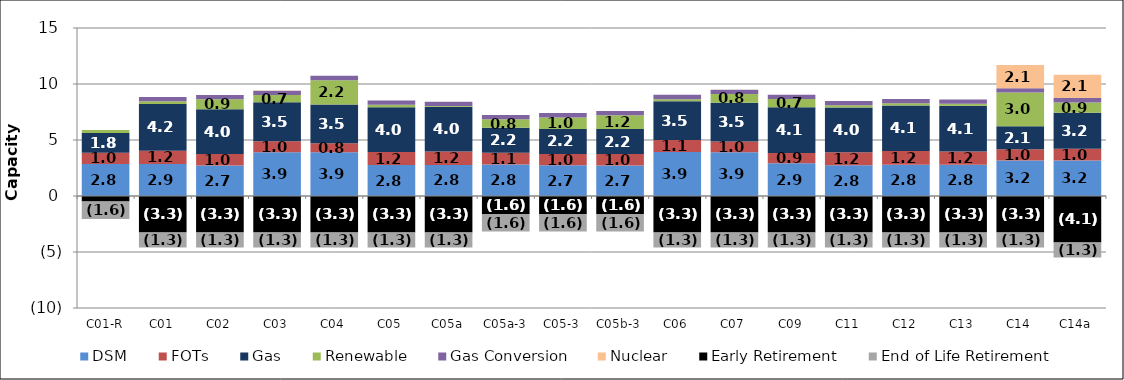
| Category | DSM | FOTs | Gas | Renewable | Gas Conversion | Nuclear | Early Retirement | End of Life Retirement |
|---|---|---|---|---|---|---|---|---|
| C01-R | 2.847 | 1.013 | 1.772 | 0.263 | 0 | 0 | -0.502 | -1.552 |
| C01 | 2.859 | 1.175 | 4.185 | 0.24 | 0.387 | 0.002 | -3.26 | -1.342 |
| C02 | 2.732 | 1.024 | 3.998 | 0.886 | 0.387 | 0 | -3.26 | -1.342 |
| C03 | 3.912 | 0.988 | 3.464 | 0.656 | 0.387 | 0.004 | -3.26 | -1.342 |
| C04 | 3.914 | 0.801 | 3.464 | 2.161 | 0.387 | 0 | -3.26 | -1.342 |
| C05 | 2.758 | 1.173 | 3.998 | 0.221 | 0.387 | 0 | -3.26 | -1.342 |
| C05a | 2.777 | 1.193 | 3.998 | 0.071 | 0.387 | 0 | -3.26 | -1.342 |
| C05a-3 | 2.81 | 1.059 | 2.217 | 0.764 | 0.387 | 0 | -1.608 | -1.554 |
| C05-3 | 2.735 | 1.026 | 2.217 | 1.039 | 0.387 | 0 | -1.608 | -1.554 |
| C05b-3 | 2.729 | 1.028 | 2.217 | 1.226 | 0.387 | 0 | -1.608 | -1.554 |
| C06 | 3.919 | 1.086 | 3.464 | 0.175 | 0.387 | 0 | -3.26 | -1.342 |
| C07 | 3.914 | 0.957 | 3.464 | 0.767 | 0.387 | 0 | -3.26 | -1.342 |
| C09 | 2.927 | 0.908 | 4.099 | 0.727 | 0.387 | 0 | -3.26 | -1.342 |
| C11 | 2.755 | 1.157 | 3.998 | 0.187 | 0.387 | 0 | -3.26 | -1.342 |
| C12 | 2.799 | 1.208 | 4.083 | 0.182 | 0.387 | 0 | -3.26 | -1.342 |
| C13 | 2.801 | 1.17 | 4.083 | 0.182 | 0.387 | 0 | -3.26 | -1.342 |
| C14 | 3.164 | 1.002 | 2.066 | 2.999 | 0.387 | 2.074 | -3.26 | -1.342 |
| C14a | 3.173 | 1.046 | 3.207 | 0.93 | 0.387 | 2.074 | -4.145 | -1.342 |